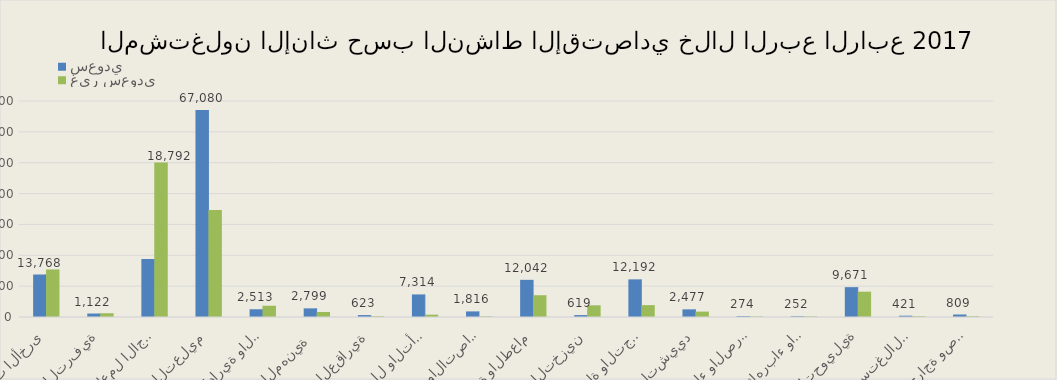
| Category | سعودي        | غير سعودي         |
|---|---|---|
| الزراعة والحراجة وصيد الأسماك | 809 | 246 |
| التعدين واستغلال المحاجر | 421 | 256 |
| الصناعة التحويلية | 9671 | 8208 |
| توصيل الكهرباء والغاز  | 252 | 199 |
| امدادات الماء والصرف الصحي | 274 | 166 |
| التشييد | 2477 | 1748 |
| تجارة الجملة والتجزئة | 12192 | 3846 |
| النقل والتخزين | 619 | 3787 |
| الإقامة والطعام | 12042 | 7054 |
| المعلومات والاتصالات | 1816 | 205 |
| أنشطة المال والتأمين | 7314 | 751 |
| الأنشطة العقارية | 623 | 250 |
| الأنشطة المهنية  | 2799 | 1624 |
| الخدمات الإدارية والدعم | 2513 | 3648 |
| التعليم | 67080 | 34655 |
| الصحة والعمل الاجتماعي | 18792 | 50094 |
| الفنون والترفية | 1122 | 1214 |
| الخدمات الأخرى | 13768 | 15407 |